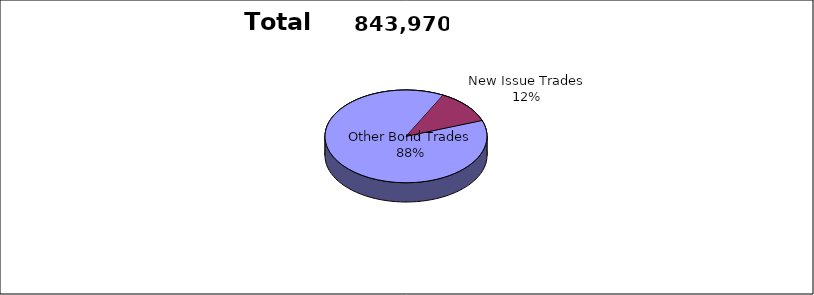
| Category | Series 0 |
|---|---|
| Other Bond Trades | 743666 |
| New Issue Trades | 100304 |